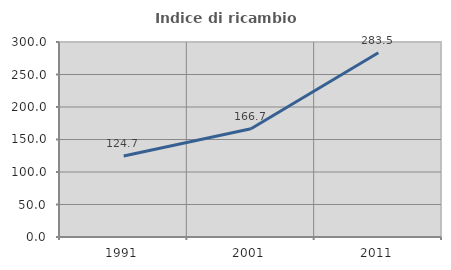
| Category | Indice di ricambio occupazionale  |
|---|---|
| 1991.0 | 124.731 |
| 2001.0 | 166.667 |
| 2011.0 | 283.465 |